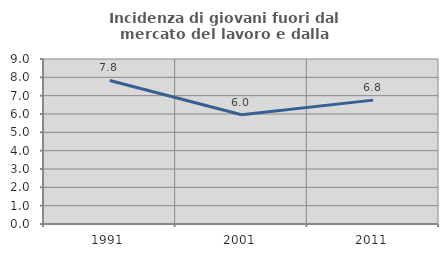
| Category | Incidenza di giovani fuori dal mercato del lavoro e dalla formazione  |
|---|---|
| 1991.0 | 7.83 |
| 2001.0 | 5.957 |
| 2011.0 | 6.757 |